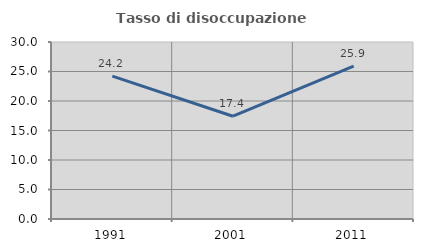
| Category | Tasso di disoccupazione giovanile  |
|---|---|
| 1991.0 | 24.209 |
| 2001.0 | 17.419 |
| 2011.0 | 25.915 |